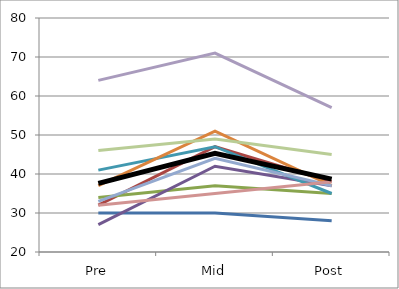
| Category | Series 0 | Series 1 | Series 2 | Series 3 | Series 4 | Series 5 | Series 6 | Series 7 | Series 8 | Series 9 | Mean |
|---|---|---|---|---|---|---|---|---|---|---|---|
| Pre | 30 | 32 | 34 | 27 | 41 | 37 | 33 | 32 | 46 | 64 | 37.6 |
| Mid | 30 | 47 | 37 | 42 | 47 | 51 | 44 | 35 | 49 | 71 | 45.3 |
| Post | 28 | 38 | 35 | 37 | 35 | 37 | 37 | 38 | 45 | 57 | 38.7 |